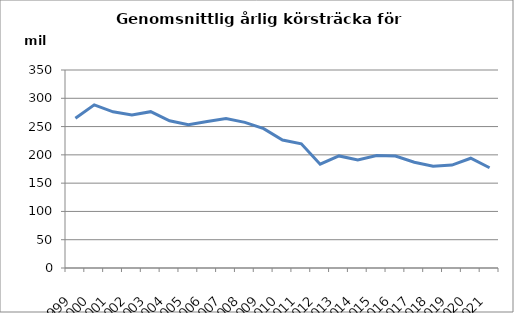
| Category | Series 0 |
|---|---|
| 1999.0 | 264.709 |
| 2000.0 | 288.43 |
| 2001.0 | 276.111 |
| 2002.0 | 270.644 |
| 2003.0 | 276.316 |
| 2004.0 | 260.212 |
| 2005.0 | 253.081 |
| 2006.0 | 258.824 |
| 2007.0 | 264.121 |
| 2008.0 | 257.478 |
| 2009.0 | 246.424 |
| 2010.0 | 226.301 |
| 2011.0 | 219.472 |
| 2012.0 | 183.491 |
| 2013.0 | 198.089 |
| 2014.0 | 191 |
| 2015.0 | 199 |
| 2016.0 | 198 |
| 2017.0 | 187 |
| 2018.0 | 180 |
| 2019.0 | 182 |
| 2020.0 | 194 |
| 2021.0 | 177.256 |